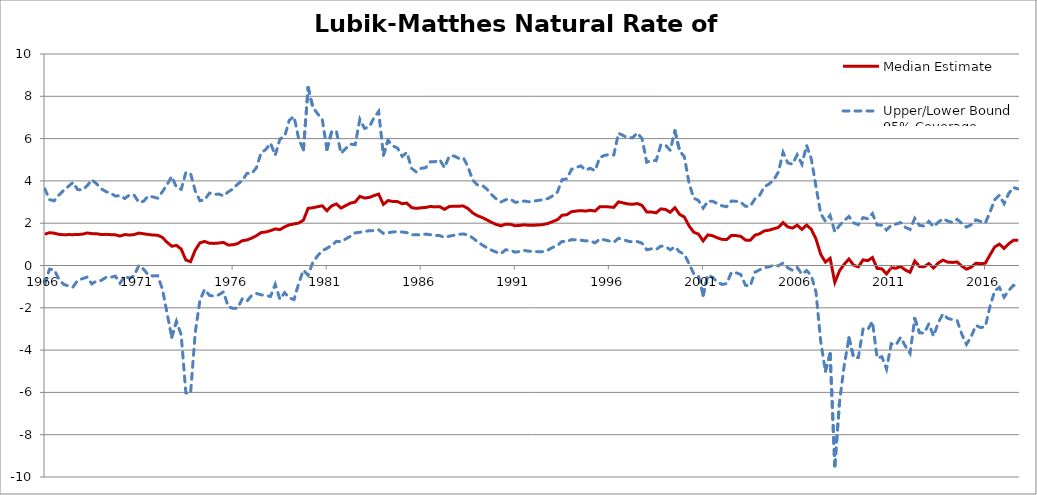
| Category | Lower Bound | Median Estimate | Upper/Lower Bound 95% Coverage Region |
|---|---|---|---|
| 1966-12-31 | -0.893 | 1.482 | 3.626 |
| 1967-03-31 | -0.174 | 1.551 | 3.115 |
| 1967-06-30 | -0.199 | 1.528 | 3.058 |
| 1967-09-30 | -0.644 | 1.473 | 3.33 |
| 1967-12-31 | -0.891 | 1.455 | 3.553 |
| 1968-03-31 | -0.961 | 1.46 | 3.737 |
| 1968-06-30 | -1.015 | 1.459 | 3.927 |
| 1968-09-30 | -0.705 | 1.464 | 3.59 |
| 1968-12-31 | -0.623 | 1.481 | 3.578 |
| 1969-03-31 | -0.55 | 1.537 | 3.768 |
| 1969-06-30 | -0.87 | 1.508 | 4.053 |
| 1969-09-30 | -0.733 | 1.502 | 3.864 |
| 1969-12-31 | -0.706 | 1.465 | 3.628 |
| 1970-03-31 | -0.564 | 1.472 | 3.494 |
| 1970-06-30 | -0.56 | 1.459 | 3.418 |
| 1970-09-30 | -0.5 | 1.452 | 3.286 |
| 1970-12-31 | -0.839 | 1.392 | 3.299 |
| 1971-03-31 | -0.497 | 1.464 | 3.166 |
| 1971-06-30 | -0.602 | 1.439 | 3.336 |
| 1971-09-30 | -0.482 | 1.461 | 3.326 |
| 1971-12-31 | 0.002 | 1.533 | 2.988 |
| 1972-03-31 | -0.173 | 1.5 | 3.037 |
| 1972-06-30 | -0.445 | 1.466 | 3.285 |
| 1972-09-30 | -0.495 | 1.441 | 3.241 |
| 1972-12-31 | -0.481 | 1.432 | 3.182 |
| 1973-03-31 | -1.107 | 1.33 | 3.486 |
| 1973-06-30 | -2.243 | 1.099 | 3.823 |
| 1973-09-30 | -3.389 | 0.912 | 4.209 |
| 1973-12-31 | -2.643 | 0.95 | 3.695 |
| 1974-03-31 | -3.269 | 0.78 | 3.6 |
| 1974-06-30 | -6.026 | 0.26 | 4.395 |
| 1974-09-30 | -6.051 | 0.18 | 4.352 |
| 1974-12-31 | -3.154 | 0.729 | 3.522 |
| 1975-03-31 | -1.638 | 1.073 | 3.061 |
| 1975-06-30 | -1.127 | 1.137 | 3.103 |
| 1975-09-30 | -1.41 | 1.053 | 3.424 |
| 1975-12-31 | -1.452 | 1.044 | 3.358 |
| 1976-03-31 | -1.386 | 1.064 | 3.378 |
| 1976-06-30 | -1.245 | 1.092 | 3.29 |
| 1976-09-30 | -1.942 | 0.97 | 3.479 |
| 1976-12-31 | -2.029 | 0.98 | 3.619 |
| 1977-03-31 | -2.02 | 1.034 | 3.843 |
| 1977-06-30 | -1.571 | 1.174 | 4.018 |
| 1977-09-30 | -1.684 | 1.207 | 4.358 |
| 1977-12-31 | -1.413 | 1.297 | 4.35 |
| 1978-03-31 | -1.324 | 1.408 | 4.621 |
| 1978-06-30 | -1.384 | 1.558 | 5.33 |
| 1978-09-30 | -1.423 | 1.584 | 5.483 |
| 1978-12-31 | -1.466 | 1.646 | 5.781 |
| 1979-03-31 | -0.891 | 1.729 | 5.212 |
| 1979-06-30 | -1.595 | 1.695 | 5.98 |
| 1979-09-30 | -1.284 | 1.825 | 6.104 |
| 1979-12-31 | -1.537 | 1.923 | 6.868 |
| 1980-03-31 | -1.61 | 1.965 | 7.047 |
| 1980-06-30 | -0.843 | 2.006 | 5.977 |
| 1980-09-30 | -0.217 | 2.142 | 5.473 |
| 1980-12-31 | -0.465 | 2.702 | 8.41 |
| 1981-03-31 | 0.151 | 2.731 | 7.482 |
| 1981-06-30 | 0.454 | 2.778 | 7.178 |
| 1981-09-30 | 0.698 | 2.824 | 6.911 |
| 1981-12-31 | 0.814 | 2.591 | 5.487 |
| 1982-03-31 | 0.947 | 2.816 | 6.322 |
| 1982-06-30 | 1.143 | 2.912 | 6.362 |
| 1982-09-30 | 1.124 | 2.715 | 5.299 |
| 1982-12-31 | 1.255 | 2.834 | 5.534 |
| 1983-03-31 | 1.384 | 2.949 | 5.738 |
| 1983-06-30 | 1.541 | 3.001 | 5.71 |
| 1983-09-30 | 1.572 | 3.268 | 6.913 |
| 1983-12-31 | 1.615 | 3.19 | 6.484 |
| 1984-03-31 | 1.645 | 3.218 | 6.545 |
| 1984-06-30 | 1.652 | 3.304 | 6.98 |
| 1984-09-30 | 1.689 | 3.378 | 7.282 |
| 1984-12-31 | 1.517 | 2.889 | 5.219 |
| 1985-03-31 | 1.547 | 3.072 | 5.915 |
| 1985-06-30 | 1.584 | 3.024 | 5.657 |
| 1985-09-30 | 1.601 | 3.021 | 5.553 |
| 1985-12-31 | 1.581 | 2.922 | 5.16 |
| 1986-03-31 | 1.554 | 2.95 | 5.347 |
| 1986-06-30 | 1.451 | 2.737 | 4.594 |
| 1986-09-30 | 1.451 | 2.699 | 4.418 |
| 1986-12-31 | 1.448 | 2.729 | 4.591 |
| 1987-03-31 | 1.487 | 2.743 | 4.625 |
| 1987-06-30 | 1.455 | 2.792 | 4.908 |
| 1987-09-30 | 1.427 | 2.77 | 4.905 |
| 1987-12-31 | 1.413 | 2.782 | 5.003 |
| 1988-03-31 | 1.321 | 2.653 | 4.623 |
| 1988-06-30 | 1.386 | 2.786 | 5.167 |
| 1988-09-30 | 1.429 | 2.805 | 5.182 |
| 1988-12-31 | 1.472 | 2.804 | 5.072 |
| 1989-03-31 | 1.493 | 2.813 | 5.096 |
| 1989-06-30 | 1.444 | 2.693 | 4.669 |
| 1989-09-30 | 1.305 | 2.486 | 4.025 |
| 1989-12-31 | 1.126 | 2.354 | 3.813 |
| 1990-03-31 | 0.974 | 2.271 | 3.796 |
| 1990-06-30 | 0.842 | 2.16 | 3.615 |
| 1990-09-30 | 0.726 | 2.04 | 3.356 |
| 1990-12-31 | 0.631 | 1.941 | 3.145 |
| 1991-03-31 | 0.562 | 1.874 | 3.001 |
| 1991-06-30 | 0.745 | 1.955 | 3.11 |
| 1991-09-30 | 0.719 | 1.949 | 3.142 |
| 1991-12-31 | 0.629 | 1.88 | 2.992 |
| 1992-03-31 | 0.66 | 1.897 | 3.005 |
| 1992-06-30 | 0.709 | 1.923 | 3.049 |
| 1992-09-30 | 0.676 | 1.898 | 3.009 |
| 1992-12-31 | 0.662 | 1.906 | 3.045 |
| 1993-03-31 | 0.653 | 1.915 | 3.081 |
| 1993-06-30 | 0.656 | 1.938 | 3.111 |
| 1993-09-30 | 0.734 | 1.988 | 3.166 |
| 1993-12-31 | 0.854 | 2.075 | 3.292 |
| 1994-03-31 | 0.95 | 2.163 | 3.472 |
| 1994-06-30 | 1.141 | 2.377 | 4.058 |
| 1994-09-30 | 1.125 | 2.4 | 4.099 |
| 1994-12-31 | 1.225 | 2.545 | 4.544 |
| 1995-03-31 | 1.21 | 2.573 | 4.636 |
| 1995-06-30 | 1.197 | 2.595 | 4.709 |
| 1995-09-30 | 1.164 | 2.574 | 4.508 |
| 1995-12-31 | 1.166 | 2.611 | 4.597 |
| 1996-03-31 | 1.071 | 2.573 | 4.478 |
| 1996-06-30 | 1.245 | 2.773 | 5.101 |
| 1996-09-30 | 1.213 | 2.78 | 5.204 |
| 1996-12-31 | 1.161 | 2.771 | 5.245 |
| 1997-03-31 | 1.098 | 2.749 | 5.225 |
| 1997-06-30 | 1.287 | 3.008 | 6.255 |
| 1997-09-30 | 1.224 | 2.961 | 6.142 |
| 1997-12-31 | 1.15 | 2.91 | 6.037 |
| 1998-03-31 | 1.115 | 2.893 | 6.04 |
| 1998-06-30 | 1.134 | 2.929 | 6.269 |
| 1998-09-30 | 1.054 | 2.846 | 6 |
| 1998-12-31 | 0.745 | 2.53 | 4.884 |
| 1999-03-31 | 0.788 | 2.529 | 4.963 |
| 1999-06-30 | 0.752 | 2.489 | 4.958 |
| 1999-09-30 | 0.92 | 2.676 | 5.709 |
| 1999-12-31 | 0.892 | 2.65 | 5.693 |
| 2000-03-31 | 0.743 | 2.517 | 5.446 |
| 2000-06-30 | 0.88 | 2.732 | 6.369 |
| 2000-09-30 | 0.645 | 2.416 | 5.412 |
| 2000-12-31 | 0.529 | 2.292 | 5.148 |
| 2001-03-31 | 0.085 | 1.875 | 3.895 |
| 2001-06-30 | -0.386 | 1.574 | 3.185 |
| 2001-09-30 | -0.489 | 1.486 | 3.077 |
| 2001-12-31 | -1.41 | 1.164 | 2.713 |
| 2002-03-31 | -0.448 | 1.448 | 3.039 |
| 2002-06-30 | -0.558 | 1.407 | 3.042 |
| 2002-09-30 | -0.781 | 1.311 | 2.928 |
| 2002-12-31 | -0.895 | 1.237 | 2.822 |
| 2003-03-31 | -0.859 | 1.225 | 2.781 |
| 2003-06-30 | -0.33 | 1.42 | 3.05 |
| 2003-09-30 | -0.345 | 1.414 | 3.036 |
| 2003-12-31 | -0.424 | 1.378 | 2.994 |
| 2004-03-31 | -0.933 | 1.201 | 2.796 |
| 2004-06-30 | -0.976 | 1.19 | 2.797 |
| 2004-09-30 | -0.319 | 1.431 | 3.143 |
| 2004-12-31 | -0.205 | 1.501 | 3.31 |
| 2005-03-31 | -0.101 | 1.634 | 3.722 |
| 2005-06-30 | -0.062 | 1.669 | 3.851 |
| 2005-09-30 | 0.017 | 1.737 | 4.04 |
| 2005-12-31 | -0.016 | 1.799 | 4.42 |
| 2006-03-31 | 0.119 | 2.031 | 5.351 |
| 2006-06-30 | -0.109 | 1.826 | 4.851 |
| 2006-09-30 | -0.226 | 1.769 | 4.788 |
| 2006-12-31 | -0.086 | 1.906 | 5.233 |
| 2007-03-31 | -0.415 | 1.704 | 4.792 |
| 2007-06-30 | -0.239 | 1.912 | 5.681 |
| 2007-09-30 | -0.475 | 1.711 | 5.041 |
| 2007-12-31 | -1.259 | 1.253 | 3.729 |
| 2008-03-31 | -3.591 | 0.528 | 2.45 |
| 2008-06-30 | -4.996 | 0.162 | 2.095 |
| 2008-09-30 | -4.164 | 0.34 | 2.371 |
| 2008-12-31 | -9.474 | -0.797 | 1.592 |
| 2009-03-31 | -6.446 | -0.253 | 1.896 |
| 2009-06-30 | -4.727 | 0.06 | 2.125 |
| 2009-09-30 | -3.419 | 0.307 | 2.317 |
| 2009-12-31 | -4.35 | 0.017 | 2.018 |
| 2010-03-31 | -4.354 | -0.063 | 1.929 |
| 2010-06-30 | -3.006 | 0.265 | 2.265 |
| 2010-09-30 | -3.034 | 0.229 | 2.21 |
| 2010-12-31 | -2.642 | 0.376 | 2.451 |
| 2011-03-31 | -4.378 | -0.137 | 1.911 |
| 2011-06-30 | -4.312 | -0.156 | 1.908 |
| 2011-09-30 | -4.897 | -0.395 | 1.679 |
| 2011-12-31 | -3.697 | -0.107 | 1.896 |
| 2012-03-31 | -3.76 | -0.131 | 1.957 |
| 2012-06-30 | -3.4 | -0.044 | 2.031 |
| 2012-09-30 | -3.811 | -0.214 | 1.803 |
| 2012-12-31 | -4.156 | -0.322 | 1.703 |
| 2013-03-31 | -2.507 | 0.21 | 2.229 |
| 2013-06-30 | -3.177 | -0.049 | 1.896 |
| 2013-09-30 | -3.2 | -0.06 | 1.866 |
| 2013-12-31 | -2.756 | 0.092 | 2.087 |
| 2014-03-31 | -3.342 | -0.119 | 1.833 |
| 2014-06-30 | -2.695 | 0.119 | 2.049 |
| 2014-09-30 | -2.289 | 0.256 | 2.209 |
| 2014-12-31 | -2.497 | 0.161 | 2.101 |
| 2015-03-31 | -2.559 | 0.145 | 2.038 |
| 2015-06-30 | -2.6 | 0.168 | 2.182 |
| 2015-09-30 | -3.247 | -0.028 | 1.997 |
| 2015-12-31 | -3.728 | -0.174 | 1.816 |
| 2016-03-31 | -3.363 | -0.08 | 1.928 |
| 2016-06-30 | -2.834 | 0.107 | 2.159 |
| 2016-09-30 | -2.935 | 0.086 | 2.086 |
| 2016-12-31 | -2.891 | 0.107 | 2.008 |
| 2017-03-31 | -1.936 | 0.502 | 2.525 |
| 2017-06-30 | -1.199 | 0.875 | 3.105 |
| 2017-09-30 | -1.035 | 1.009 | 3.323 |
| 2017-12-31 | -1.498 | 0.807 | 2.92 |
| 2018-03-31 | -1.175 | 1.03 | 3.413 |
| 2018-06-30 | -0.935 | 1.194 | 3.686 |
| 2018-09-30 | -0.98 | 1.194 | 3.619 |